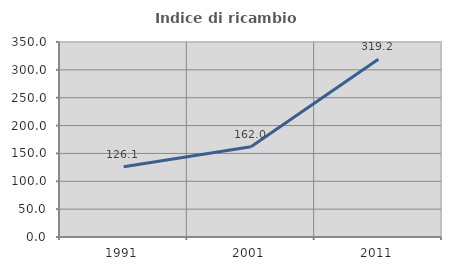
| Category | Indice di ricambio occupazionale  |
|---|---|
| 1991.0 | 126.061 |
| 2001.0 | 162.016 |
| 2011.0 | 319.192 |